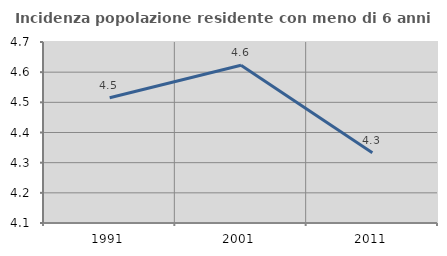
| Category | Incidenza popolazione residente con meno di 6 anni |
|---|---|
| 1991.0 | 4.515 |
| 2001.0 | 4.623 |
| 2011.0 | 4.332 |